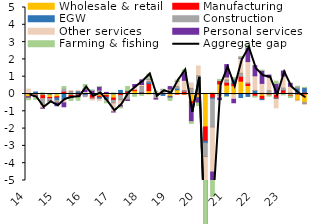
| Category | Wholesale & retail | Manufacturing | EGW | Construction | Other services | Personal services | Farming & fishing |
|---|---|---|---|---|---|---|---|
| 14 | -0.145 | -0.021 | -0.05 | -0.002 | 0.283 | -0.028 | -0.088 |
| 14.T2 | -0.064 | 0.067 | 0.05 | -0.006 | -0.008 | -0.053 | -0.178 |
| 14.T3 | -0.094 | -0.173 | 0.04 | -0.326 | -0.215 | -0.016 | 0.018 |
| 14.T4 | -0.2 | -0.076 | 0.012 | -0.084 | -0.045 | -0.028 | -0.033 |
| 15 | -0.159 | -0.071 | -0.14 | -0.088 | -0.061 | -0.161 | 0.006 |
| 15.T2 | 0.071 | 0.087 | -0.319 | 0.174 | -0.193 | -0.226 | 0.1 |
| 15.T3 | -0.087 | -0.076 | 0.02 | 0.135 | 0.032 | -0.103 | -0.108 |
| 15.T4 | -0.03 | -0.1 | 0.131 | -0.018 | 0.078 | -0.022 | -0.192 |
| 16 | 0.01 | -0.028 | -0.064 | -0.061 | 0.13 | 0.15 | 0.263 |
| 16.T2 | -0.081 | -0.161 | 0.001 | -0.019 | -0.094 | 0.215 | 0.006 |
| 16.T3 | -0.13 | -0.07 | -0.047 | 0.232 | -0.134 | 0.202 | 0.005 |
| 16.T4 | -0.087 | -0.097 | -0.125 | 0.081 | -0.128 | 0.013 | -0.071 |
| 17 | -0.233 | -0.137 | 0.001 | -0.141 | -0.527 | -0.003 | 0.067 |
| 17.T2 | 0.071 | -0.089 | 0.137 | -0.246 | -0.324 | -0.088 | -0.055 |
| 17.T3 | 0.073 | 0.095 | 0.041 | -0.329 | -0.023 | -0.023 | 0.231 |
| 17.T4 | 0.192 | 0.025 | -0.018 | -0.005 | 0.214 | 0.117 | -0.106 |
| 18 | -0.011 | 0.106 | 0.025 | 0.296 | 0.123 | 0.269 | -0.067 |
| 18.T2 | 0.19 | 0.417 | 0.093 | 0.002 | 0.127 | 0.028 | 0.297 |
| 18.T3 | -0.018 | 0.078 | -0.015 | -0.162 | -0.067 | -0.034 | 0.086 |
| 18.T4 | 0.047 | -0.01 | -0.072 | 0.111 | 0.085 | 0.022 | 0.002 |
| 19 | -0.138 | -0.026 | -0.074 | 0.288 | 0.015 | 0.126 | -0.134 |
| 19.T2 | 0.239 | -0.004 | 0.097 | 0.098 | 0.295 | 0.007 | 0.074 |
| 19.T3 | -0.014 | 0.163 | 0.004 | 0.01 | 0.612 | 0.448 | 0.164 |
| 19.T4 | -0.449 | -0.128 | -0.045 | 0.326 | 0.314 | -0.976 | -0.102 |
| 20 | -0.218 | 0.057 | -0.017 | 0.994 | 0.567 | -0.283 | -0.14 |
| 20.T2 | -1.904 | -0.827 | -0.117 | -0.767 | -4.117 | -3.119 | -0.062 |
| 20.T3 | 0.05 | -0.227 | -0.072 | -1.611 | -2.6 | -1.464 | -0.073 |
| 20.T4 | 0.584 | 0.187 | 0.008 | -0.071 | -0.16 | -0.098 | 0.069 |
| 21 | 0.515 | 0.16 | -0.141 | 0.131 | 0.177 | 0.714 | -0.004 |
| 21.T2 | 0.48 | 0.128 | 0.247 | 0.07 | -0.305 | -0.202 | 0.024 |
| 21.T3 | 0.741 | 0.287 | -0.206 | 0.17 | 0.871 | 0.055 | 0.05 |
| 21.T4 | 0.493 | 0.124 | -0.139 | 0.001 | 1.255 | 0.828 | 0.132 |
| 22 | 0.058 | -0.128 | 0.144 | 0.001 | 0.849 | 0.586 | -0.052 |
| 22.T2 | -0.135 | -0.173 | -0.018 | 0.041 | 0.572 | 0.748 | 0.017 |
| 22.T3 | 0.041 | -0.061 | 0.001 | 0.147 | 0.777 | 0.129 | -0.062 |
| 22.T4 | -0.06 | -0.174 | -0.012 | 0.051 | -0.553 | 0.561 | 0.128 |
| 23 | 0.095 | 0.141 | 0.013 | 0.091 | 0.698 | 0.29 | -0.051 |
| 23.T2 | -0.099 | -0.024 | 0.014 | 0.044 | 0.39 | 0.173 | -0.084 |
| 23.T3 | -0.333 | 0.015 | 0.33 | 0.085 | -0.052 | 0.006 | 0.01 |
| 23.T4 | -0.475 | 0.101 | 0.262 | -0.076 | -0.051 | 0.003 | 0.018 |